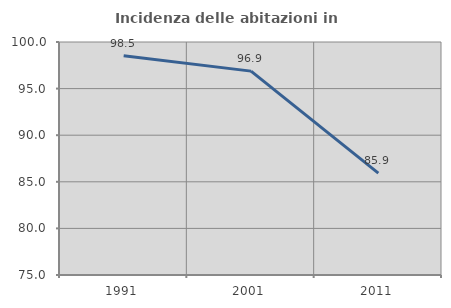
| Category | Incidenza delle abitazioni in proprietà  |
|---|---|
| 1991.0 | 98.529 |
| 2001.0 | 96.875 |
| 2011.0 | 85.938 |